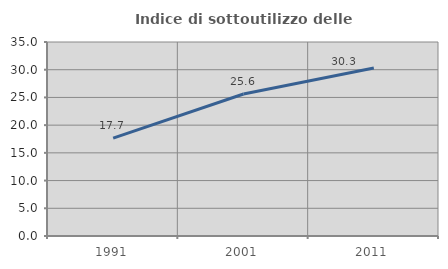
| Category | Indice di sottoutilizzo delle abitazioni  |
|---|---|
| 1991.0 | 17.668 |
| 2001.0 | 25.615 |
| 2011.0 | 30.302 |